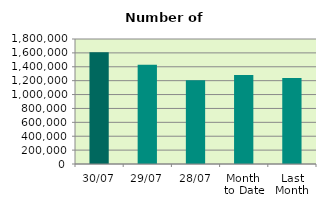
| Category | Series 0 |
|---|---|
| 30/07 | 1608436 |
| 29/07 | 1430372 |
| 28/07 | 1204420 |
| Month 
to Date | 1281605.545 |
| Last
Month | 1237407.909 |